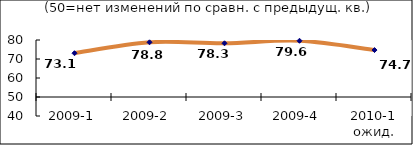
| Category | Диф.индекс ↓ |
|---|---|
| 2009-1 | 73.05 |
| 2009-2 | 78.795 |
| 2009-3 | 78.28 |
| 2009-4 | 79.6 |
| 2010-1 ожид. | 74.71 |